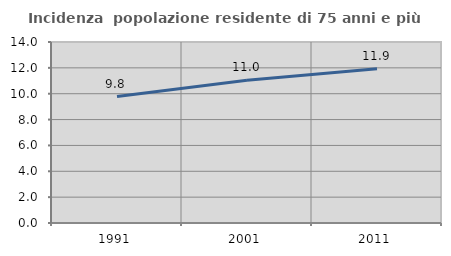
| Category | Incidenza  popolazione residente di 75 anni e più |
|---|---|
| 1991.0 | 9.783 |
| 2001.0 | 11.049 |
| 2011.0 | 11.923 |